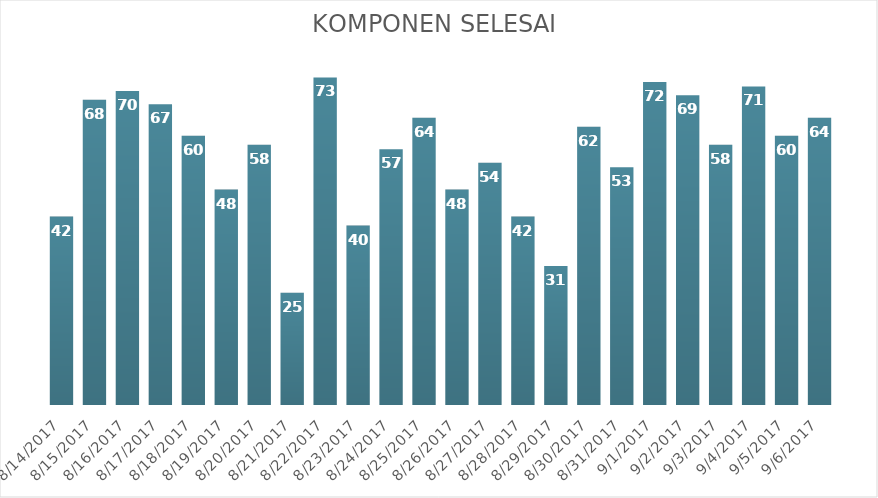
| Category | Komponen Selesai |
|---|---|
| 8/14/17 | 42 |
| 8/15/17 | 68 |
| 8/16/17 | 70 |
| 8/17/17 | 67 |
| 8/18/17 | 60 |
| 8/19/17 | 48 |
| 8/20/17 | 58 |
| 8/21/17 | 25 |
| 8/22/17 | 73 |
| 8/23/17 | 40 |
| 8/24/17 | 57 |
| 8/25/17 | 64 |
| 8/26/17 | 48 |
| 8/27/17 | 54 |
| 8/28/17 | 42 |
| 8/29/17 | 31 |
| 8/30/17 | 62 |
| 8/31/17 | 53 |
| 9/1/17 | 72 |
| 9/2/17 | 69 |
| 9/3/17 | 58 |
| 9/4/17 | 71 |
| 9/5/17 | 60 |
| 9/6/17 | 64 |